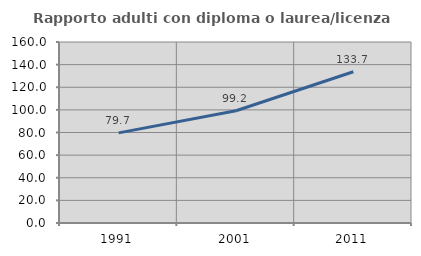
| Category | Rapporto adulti con diploma o laurea/licenza media  |
|---|---|
| 1991.0 | 79.679 |
| 2001.0 | 99.223 |
| 2011.0 | 133.694 |